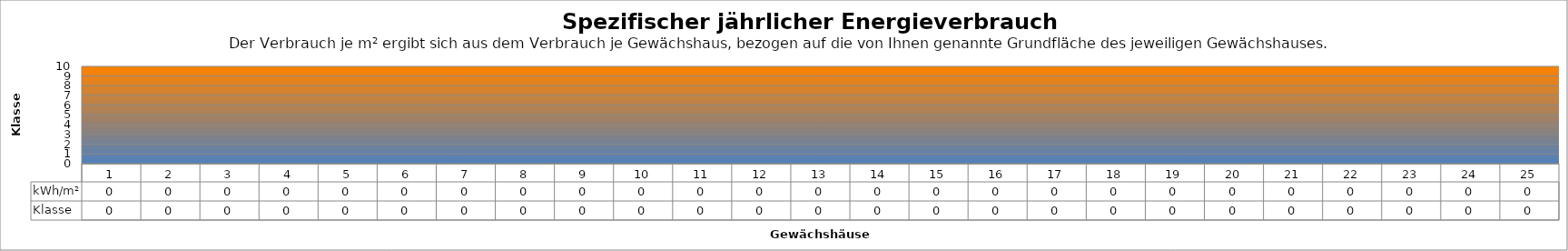
| Category | kWh/m² | Klasse |
|---|---|---|
| 0 | 0 | 0 |
| 1 | 0 | 0 |
| 2 | 0 | 0 |
| 3 | 0 | 0 |
| 4 | 0 | 0 |
| 5 | 0 | 0 |
| 6 | 0 | 0 |
| 7 | 0 | 0 |
| 8 | 0 | 0 |
| 9 | 0 | 0 |
| 10 | 0 | 0 |
| 11 | 0 | 0 |
| 12 | 0 | 0 |
| 13 | 0 | 0 |
| 14 | 0 | 0 |
| 15 | 0 | 0 |
| 16 | 0 | 0 |
| 17 | 0 | 0 |
| 18 | 0 | 0 |
| 19 | 0 | 0 |
| 20 | 0 | 0 |
| 21 | 0 | 0 |
| 22 | 0 | 0 |
| 23 | 0 | 0 |
| 24 | 0 | 0 |